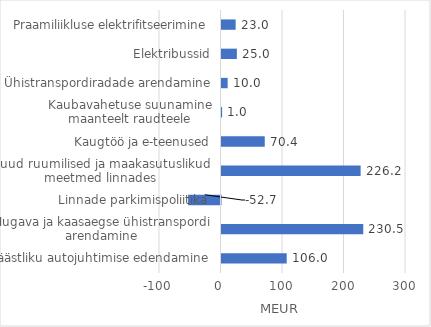
| Category | Series 0 |
|---|---|
| Säästliku autojuhtimise edendamine  | 106.045 |
| Mugava ja kaasaegse ühistranspordi arendamine | 230.491 |
| Linnade parkimispoliitika | -52.684 |
| Muud ruumilised ja maakasutuslikud meetmed linnades | 226.223 |
| Kaugtöö ja e-teenused | 70.357 |
| Kaubavahetuse suunamine maanteelt raudteele | 1 |
| Ühistranspordiradade arendamine | 10 |
| Elektribussid | 25 |
| Praamiliikluse elektrifitseerimine | 23 |